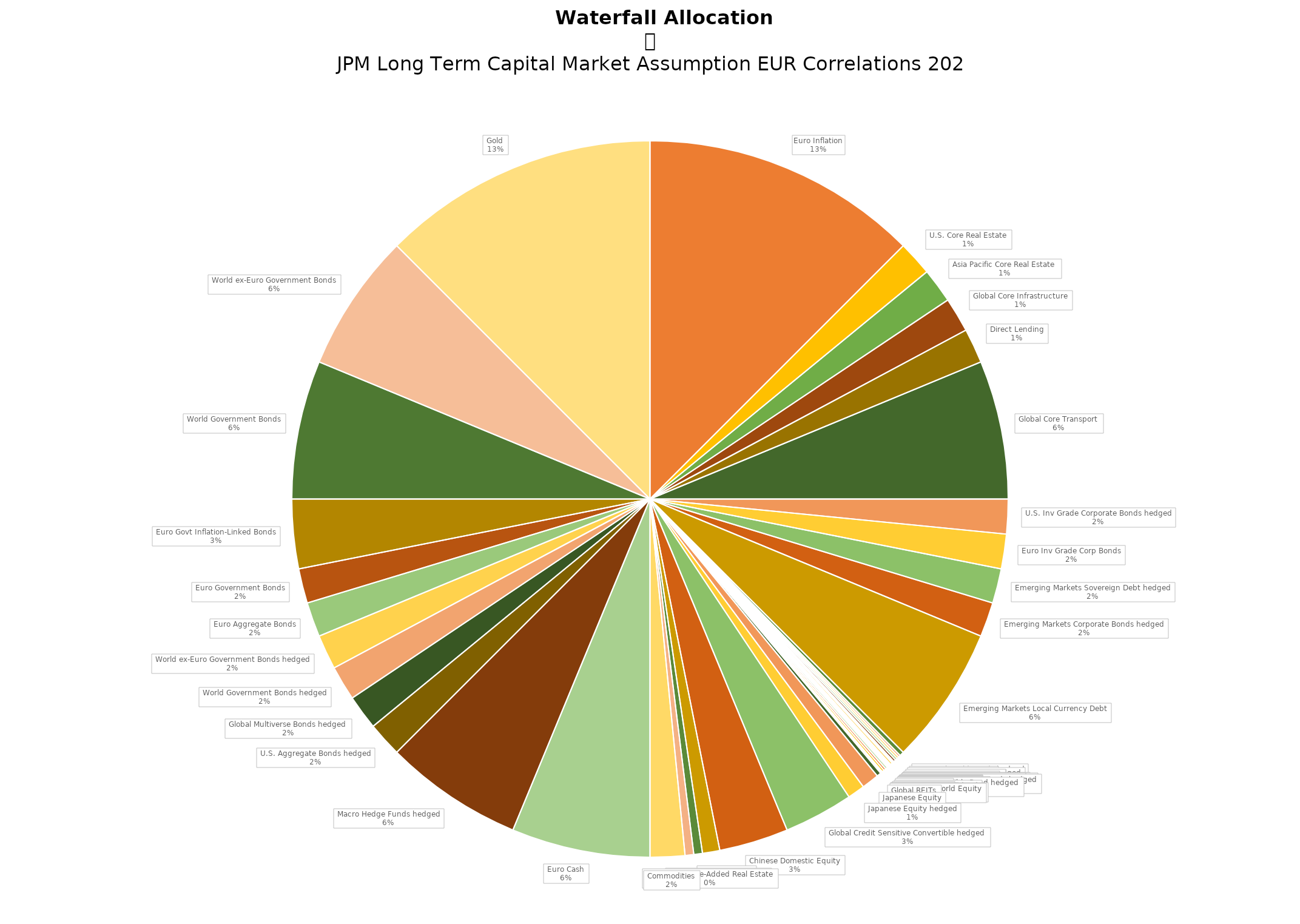
| Category | Series 0 |
|---|---|
| Euro Inflation | 0.125 |
|  U.S. Core Real Estate  | 0.016 |
|  Asia Pacific Core Real Estate  | 0.016 |
|  Global Core Infrastructure  | 0.016 |
|  Direct Lending  | 0.016 |
|  Global Core Transport  | 0.062 |
|  U.S. Inv Grade Corporate Bonds hedged  | 0.016 |
|  Euro Inv Grade Corp Bonds  | 0.016 |
|  Emerging Markets Sovereign Debt hedged  | 0.016 |
|  Emerging Markets Corporate Bonds hedged  | 0.016 |
|  Emerging Markets Local Currency Debt  | 0.062 |
|  U.S. High Yield Bonds hedged  | 0.002 |
|  Euro High Yield Bonds  | 0.001 |
|  U.S. Leveraged Loans hedged  | 0.001 |
|  Emerging Markets Equity  | 0.001 |
|  AC Asia ex-Japan Equity  | 0.001 |
|  Diversified Hedge Funds hedged  | 0 |
|  Event Driven Hedge Funds hedged  | 0 |
|  Long Bias Hedge Funds hedged  | 0 |
|  Relative Value Hedge Funds hedged  | 0.001 |
|  European Large Cap  | 0 |
|  Euro Area Large Cap  | 0 |
|  European Small Cap  | 0 |
|  Euro Area Small Cap  | 0 |
|  U.S. Large Cap hedged  | 0 |
|  Global Convertible Bond hedged  | 0 |
|  UK Large Cap  | 0.001 |
|  UK Large Cap hedged  | 0.001 |
|  U.S. Large Cap  | 0.001 |
|  AC World Equity  | 0 |
|  AC World ex-EMU Equity  | 0 |
|  Developed World Equity  | 0 |
|  Global REITs  | 0.002 |
|  Japanese Equity  | 0.008 |
|  Japanese Equity hedged  | 0.008 |
|  Global Credit Sensitive Convertible hedged  | 0.031 |
|  Chinese Domestic Equity  | 0.031 |
|  Private Equity  | 0.008 |
|  European Core Real Estate  | 0.004 |
|  European Value-Added Real Estate  | 0.004 |
|  Commodities  | 0.016 |
|  Euro Cash  | 0.062 |
|  Macro Hedge Funds hedged  | 0.062 |
|  U.S. Aggregate Bonds hedged  | 0.016 |
|  Global Multiverse Bonds hedged  | 0.016 |
|  World Government Bonds hedged  | 0.016 |
|  World ex-Euro Government Bonds hedged  | 0.016 |
|  Euro Aggregate Bonds  | 0.016 |
|  Euro Government Bonds  | 0.016 |
|  Euro Govt Inflation-Linked Bonds  | 0.031 |
|  World Government Bonds  | 0.062 |
|  World ex-Euro Government Bonds  | 0.062 |
|  Gold  | 0.125 |